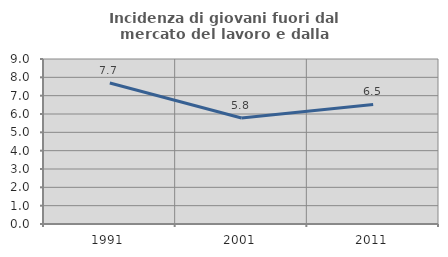
| Category | Incidenza di giovani fuori dal mercato del lavoro e dalla formazione  |
|---|---|
| 1991.0 | 7.692 |
| 2001.0 | 5.785 |
| 2011.0 | 6.522 |